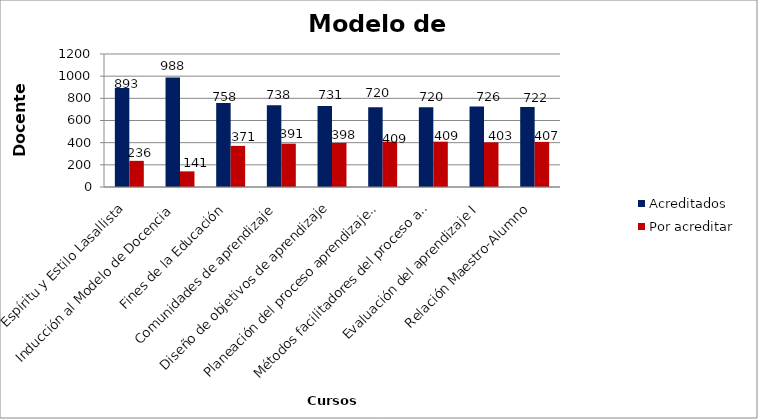
| Category | Acreditados | Por acreditar |
|---|---|---|
| Espíritu y Estilo Lasallista | 893 | 236 |
| Inducción al Modelo de Docencia | 988 | 141 |
| Fines de la Educación | 758 | 371 |
| Comunidades de aprendizaje | 738 | 391 |
| Diseño de objetivos de aprendizaje | 731 | 398 |
| Planeación del proceso aprendizaje-enseñanza I | 720 | 409 |
| Métodos facilitadores del proceso aprendizaje - enseñanza I | 720 | 409 |
| Evaluación del aprendizaje I | 726 | 403 |
| Relación Maestro-Alumno | 722 | 407 |